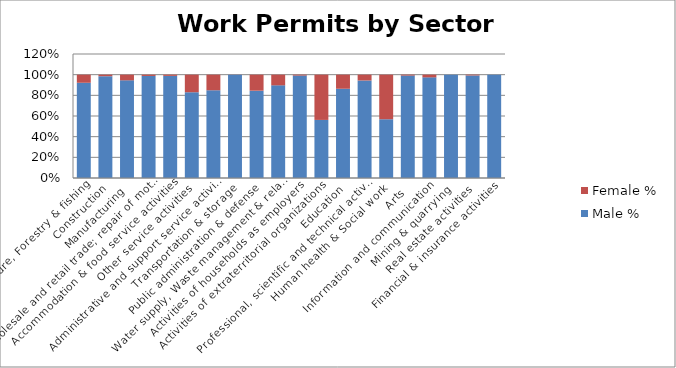
| Category | Male % | Female % |
|---|---|---|
| Agriculture, Forestry & fishing | 0.922 | 0.078 |
| Construction | 0.985 | 0.015 |
| Manufacturing | 0.945 | 0.055 |
| Wholesale and retail trade; repair of motor vehicles  | 0.987 | 0.013 |
| Accommodation & food service activities | 0.988 | 0.012 |
| Other service activities | 0.83 | 0.17 |
| Administrative and support service activities | 0.849 | 0.151 |
| Transportation & storage | 0.999 | 0.001 |
| Public administration & defense | 0.845 | 0.155 |
| Water supply, Waste management & related activities | 0.897 | 0.103 |
| Activities of households as employers | 0.991 | 0.009 |
| Activities of extraterritorial organizations  | 0.562 | 0.438 |
| Education | 0.864 | 0.136 |
| Professional, scientific and technical activities | 0.944 | 0.056 |
| Human health & Social work | 0.569 | 0.431 |
| Arts | 0.991 | 0.009 |
| Information and communication | 0.974 | 0.026 |
| Mining & quarrying | 1 | 0 |
| Real estate activities | 0.992 | 0.008 |
| Financial & insurance activities | 1 | 0 |